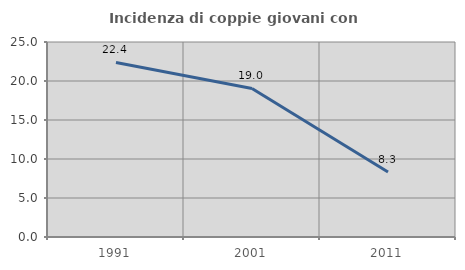
| Category | Incidenza di coppie giovani con figli |
|---|---|
| 1991.0 | 22.374 |
| 2001.0 | 19.048 |
| 2011.0 | 8.333 |